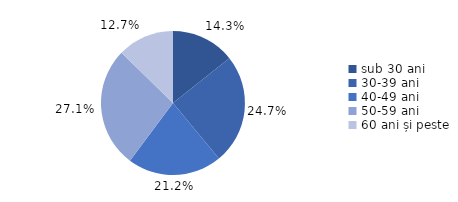
| Category | Series 0 |
|---|---|
| sub 30 ani | 0.143 |
| 30-39 ani | 0.247 |
| 40-49 ani | 0.212 |
| 50-59 ani | 0.271 |
| 60 ani și peste | 0.127 |